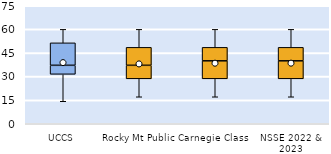
| Category | 25th | 50th | 75th |
|---|---|---|---|
| UCCS | 31.429 | 5.714 | 14.286 |
| Rocky Mt Public | 28.571 | 8.571 | 11.429 |
| Carnegie Class | 28.571 | 11.429 | 8.571 |
| NSSE 2022 & 2023 | 28.571 | 11.429 | 8.571 |